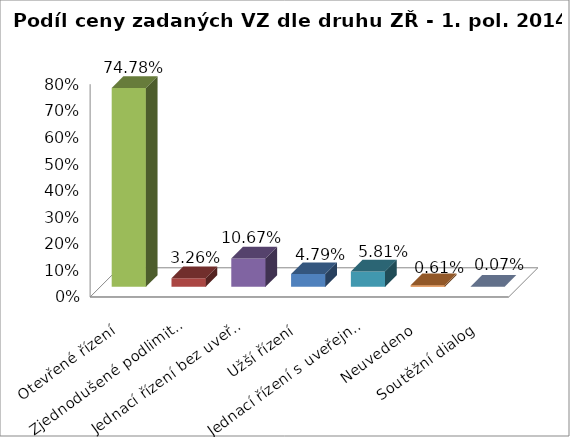
| Category | Series 0 |
|---|---|
| Otevřené řízení | 0.748 |
| Zjednodušené podlimitní řízení | 0.033 |
| Jednací řízení bez uveřejnění | 0.107 |
| Užší řízení | 0.048 |
| Jednací řízení s uveřejněním  | 0.058 |
| Neuvedeno | 0.006 |
| Soutěžní dialog | 0.001 |